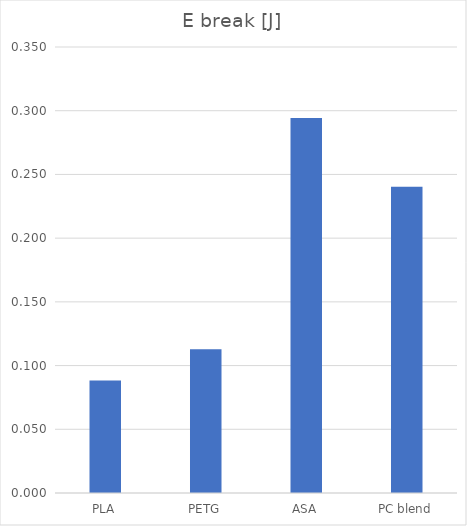
| Category | E br [J] |
|---|---|
| PLA | 0.088 |
| PETG | 0.113 |
| ASA | 0.294 |
| PC blend | 0.24 |